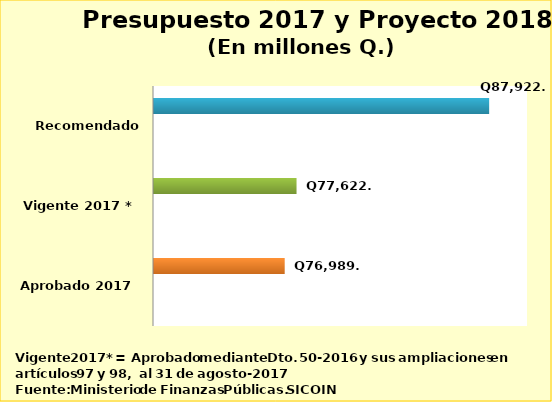
| Category | Series 0 | Series 2 | Series 3 |
|---|---|---|---|
| Aprobado 2017 |  |  | 76989.4 |
| Vigente 2017 * |  |  | 77622.6 |
| Recomendado 2018 |  |  | 87922.9 |